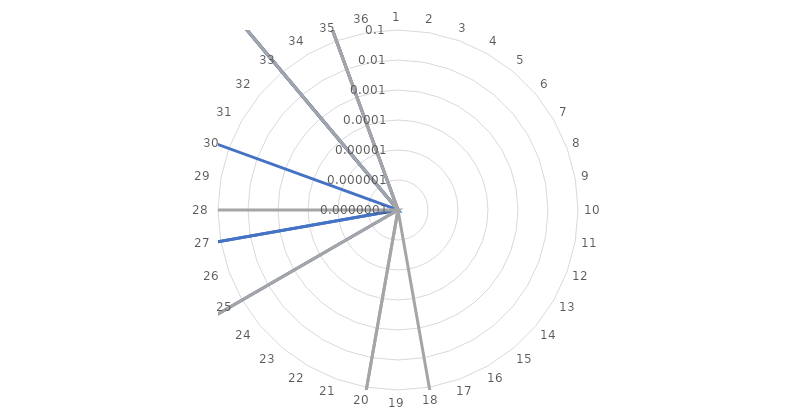
| Category | miR-143-3p | miR-423-5p | miR-193-3p | miR-130b-3p | miR-210-3p | miR-486-5p |
|---|---|---|---|---|---|---|
| 1.0 | 0 | 0 | 0 | 0 | 0.001 | 0 |
| 2.0 | 0 | 0 | 0 | 0.001 | 0.005 | 0 |
| 3.0 | 0 | 0 | 0 | 0 | 0 | 0 |
| 4.0 | 0 | 0 | 0 | 0 | 0 | 0 |
| 5.0 | 0 | 0 | 0 | 0 | 0 | 0 |
| 6.0 | 0 | 0.011 | 0 | 0.001 | 0.002 | 0 |
| 7.0 | 0 | 0 | 0 | 0 | 0 | 0 |
| 8.0 | 0 | 0 | 0 | 0 | 0 | 0 |
| 9.0 | 0 | 0 | 0 | 0 | 0 | 0 |
| 10.0 | 0 | 0 | 0 | 0 | 0 | 0 |
| 11.0 | 0 | 0 | 0 | 0 | 0 | 0 |
| 12.0 | 0 | 0 | 0 | 0 | 0 | 0 |
| 13.0 | 0 | 0 | 0 | 0 | 0 | 0 |
| 14.0 | 0 | 0 | 0 | 0 | 0 | 0 |
| 15.0 | 0 | 0 | 0 | 0 | 0 | 0 |
| 16.0 | 0 | 0 | 0 | 0 | 0 | 0 |
| 17.0 | 0 | 0 | 0 | 0 | 0 | 0 |
| 18.0 | 0 | 0 | 0 | 0 | 0 | 0 |
| 19.0 | 0 | 0 | 0 | 0 | 0 | 0 |
| 20.0 | 0 | 0.001 | 0 | 0 | 0 | 0.034 |
| 21.0 | 0 | 0 | 0 | 0 | 0 | 0 |
| 22.0 | 0 | 0 | 0 | 0 | 0 | 0 |
| 23.0 | 0 | 0 | 0 | 0 | 0 | 0 |
| 24.0 | 0 | 0 | 0 | 0.003 | 0.001 | 0 |
| 25.0 | 0 | 0 | 0 | 0 | 0 | 0 |
| 26.0 | 0 | 0 | 0 | 0 | 0 | 0 |
| 27.0 | 0 | 0 | 0 | 0 | 0 | 0 |
| 28.0 | 0 | 0 | 0 | 0 | 0 | 0 |
| 29.0 | 0 | 0 | 0 | 0 | 0 | 0 |
| 30.0 | 0 | 0 | 0 | 0 | 0 | 0 |
| 31.0 | 0 | 0 | 0 | 0 | 0 | 0 |
| 32.0 | 0 | 0 | 0 | 0 | 0 | 0 |
| 33.0 | 0 | 0 | 0 | 0 | 0 | 0 |
| 34.0 | 0 | 0 | 0 | 0 | 0 | 0 |
| 35.0 | 0 | 0 | 0 | 0 | 0 | 0 |
| 36.0 | 0 | 0 | 0 | 0 | 0 | 0 |